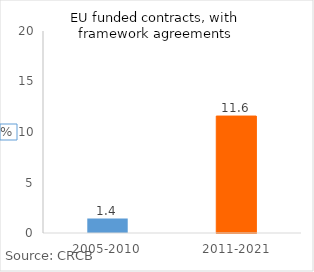
| Category | mgts_plus, with framework agreements, % |
|---|---|
| 2005-2010 | 1.425 |
| 2011-2021 | 11.579 |